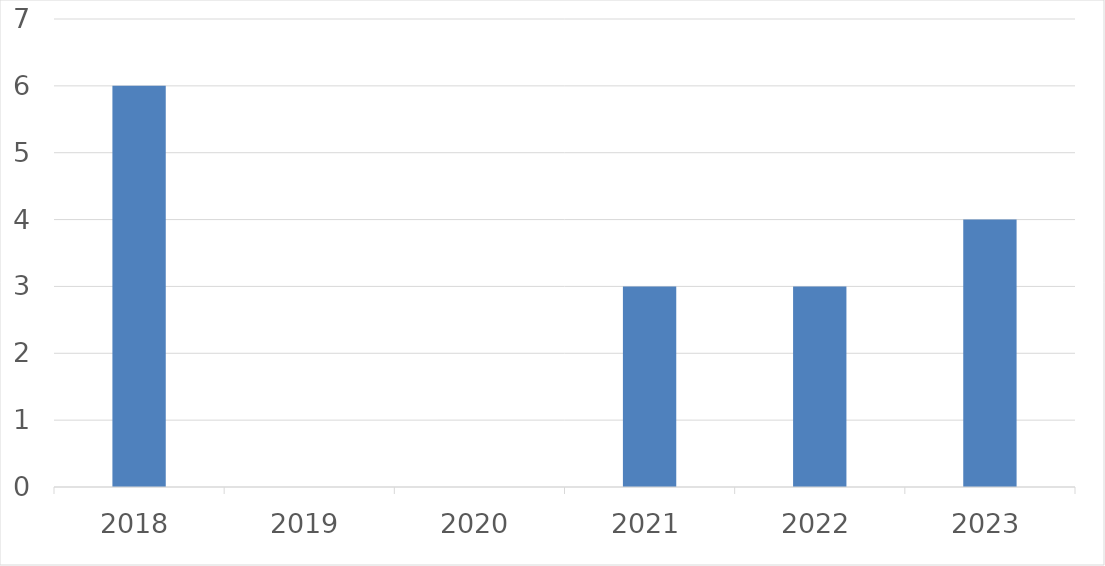
| Category | Series 0 |
|---|---|
| 2018 | 6 |
| 2019 | 0 |
| 2020 | 0 |
| 2021 | 3 |
| 2022 | 3 |
| 2023 | 4 |